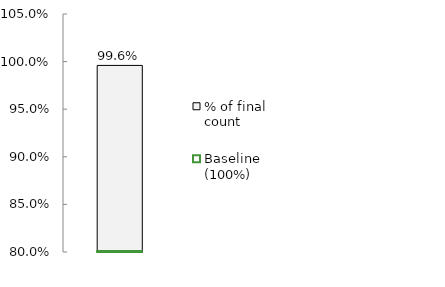
| Category | % of final count |
|---|---|
| 0 | 0.996 |